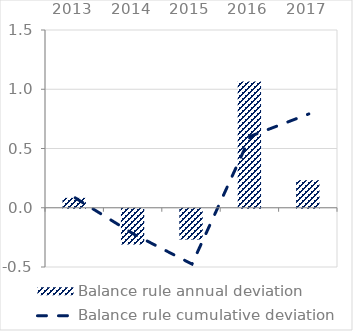
| Category | Balance rule annual deviation |
|---|---|
| 2013.0 | 0.083 |
| 2014.0 | -0.302 |
| 2015.0 | -0.26 |
| 2016.0 | 1.066 |
| 2017.0 | 0.233 |